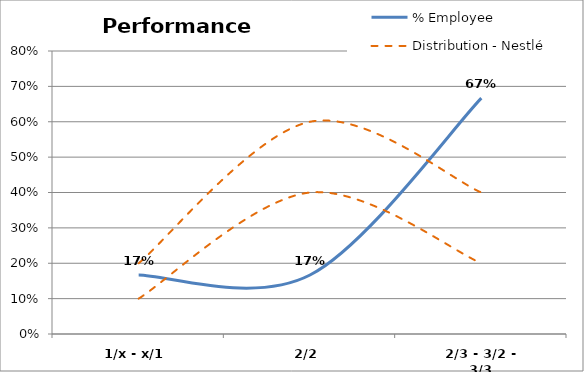
| Category | % Employee | Distribution - Nestlé Guideline |
|---|---|---|
| 1/x - x/1 | 0.167 | 0.2 |
| 2/2 | 0.167 | 0.6 |
| 2/3 - 3/2 - 3/3 | 0.667 | 0.4 |